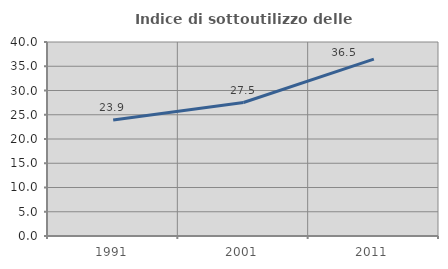
| Category | Indice di sottoutilizzo delle abitazioni  |
|---|---|
| 1991.0 | 23.907 |
| 2001.0 | 27.518 |
| 2011.0 | 36.462 |